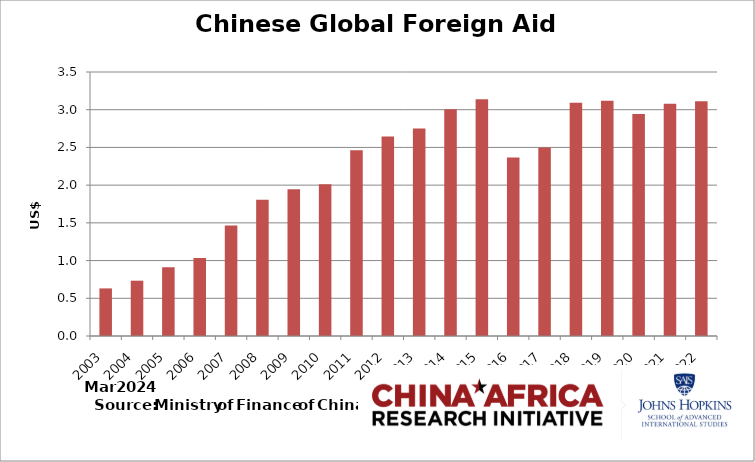
| Category | Series 1 |
|---|---|
| 2003.0 | 0.631 |
| 2004.0 | 0.733 |
| 2005.0 | 0.912 |
| 2006.0 | 1.033 |
| 2007.0 | 1.466 |
| 2008.0 | 1.807 |
| 2009.0 | 1.946 |
| 2010.0 | 2.011 |
| 2011.0 | 2.462 |
| 2012.0 | 2.645 |
| 2013.0 | 2.752 |
| 2014.0 | 3.005 |
| 2015.0 | 3.137 |
| 2016.0 | 2.366 |
| 2017.0 | 2.5 |
| 2018.0 | 3.093 |
| 2019.0 | 3.119 |
| 2020.0 | 2.942 |
| 2021.0 | 3.08 |
| 2022.0 | 3.114 |